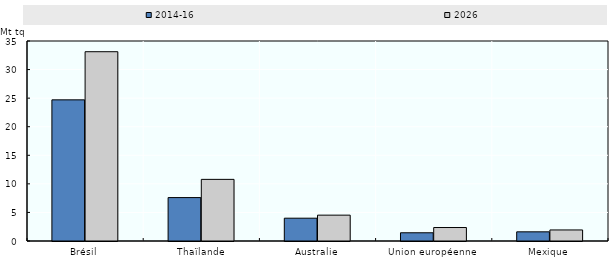
| Category | 2014-16 | 2026 |
|---|---|---|
| Brésil | 24.7 | 33.124 |
| Thaïlande | 7.597 | 10.786 |
| Australie | 3.99 | 4.523 |
| Union européenne | 1.441 | 2.357 |
| Mexique | 1.603 | 1.934 |